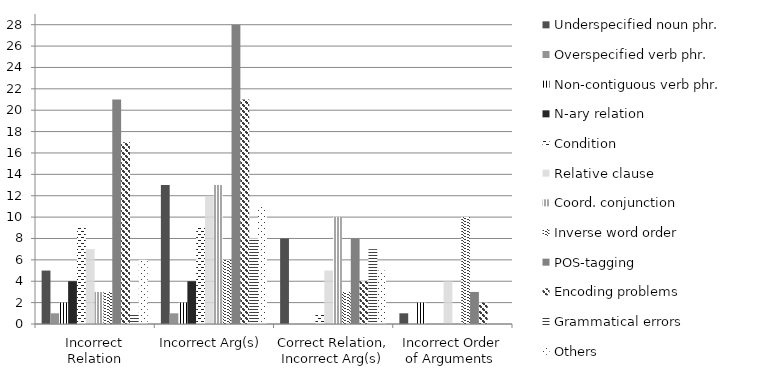
| Category | Underspecified noun phr. | Overspecified verb phr. | Non-contiguous verb phr. | N-ary relation   | Condition | Relative clause | Coord. conjunction | Inverse word order | POS-tagging | Encoding problems | Grammatical errors | Others |
|---|---|---|---|---|---|---|---|---|---|---|---|---|
| Incorrect Relation | 5 | 1 | 2 | 4 | 9 | 7 | 3 | 3 | 21 | 17 | 1 | 6 |
| Incorrect Arg(s) | 13 | 1 | 2 | 4 | 9 | 12 | 13 | 6 | 28 | 21 | 8 | 11 |
| Correct Relation, Incorrect Arg(s) | 8 | 0 | 0 | 0 | 1 | 5 | 10 | 3 | 8 | 4 | 7 | 5 |
| Incorrect Order of Arguments  | 1 | 0 | 2 | 0 | 0 | 4 | 0 | 10 | 3 | 2 | 0 | 0 |